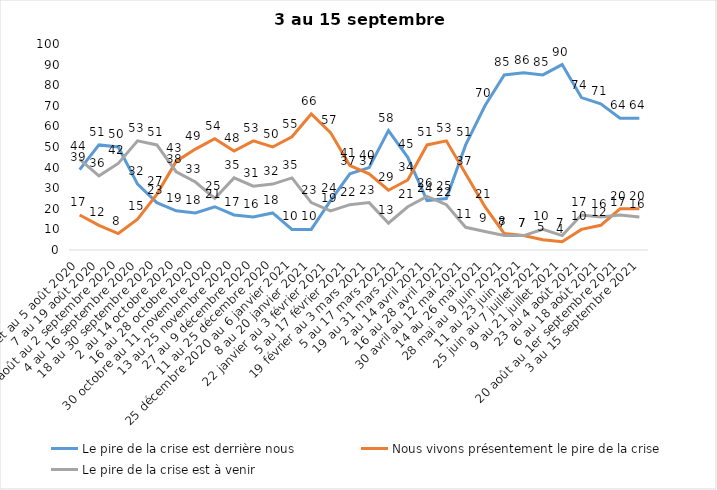
| Category | Le pire de la crise est derrière nous | Nous vivons présentement le pire de la crise | Le pire de la crise est à venir |
|---|---|---|---|
| 24 juillet au 5 août 2020 | 39 | 17 | 44 |
| 7 au 19 août 2020 | 51 | 12 | 36 |
| 21 août au 2 septembre 2020 | 50 | 8 | 42 |
| 4 au 16 septembre 2020 | 32 | 15 | 53 |
| 18 au 30 septembre 2020 | 23 | 27 | 51 |
| 2 au 14 octobre 2020 | 19 | 43 | 38 |
| 16 au 28 octobre 2020 | 18 | 49 | 33 |
| 30 octobre au 11 novembre 2020 | 21 | 54 | 25 |
| 13 au 25 novembre 2020 | 17 | 48 | 35 |
| 27 au 9 décembre 2020 | 16 | 53 | 31 |
| 11 au 25 décembre 2020 | 18 | 50 | 32 |
| 25 décembre 2020 au 6 janvier 2021 | 10 | 55 | 35 |
| 8 au 20 janvier 2021 | 10 | 66 | 23 |
| 22 janvier au 3 février 2021 | 24 | 57 | 19 |
| 5 au 17 février 2021 | 37 | 41 | 22 |
| 19 février au 3 mars 2021 | 40 | 37 | 23 |
| 5 au 17 mars 2021 | 58 | 29 | 13 |
| 19 au 31 mars 2021 | 45 | 34 | 21 |
| 2 au 14 avril 2021 | 24 | 51 | 26 |
| 16 au 28 avril 2021 | 25 | 53 | 22 |
| 30 avril au 12 mai 2021 | 51 | 37 | 11 |
| 14 au 26 mai 2021 | 70 | 21 | 9 |
| 28 mai au 9 juin 2021 | 85 | 8 | 7 |
| 11 au 23 juin 2021 | 86 | 7 | 7 |
| 25 juin au 7 juillet 2021 | 85 | 5 | 10 |
| 9 au 21 juillet 2021 | 90 | 4 | 7 |
| 23 au 4 août 2021 | 74 | 10 | 17 |
| 6 au 18 août 2021 | 71 | 12 | 16 |
| 20 août au 1er septembre 2021 | 64 | 20 | 17 |
| 3 au 15 septembre 2021 | 64 | 20 | 16 |